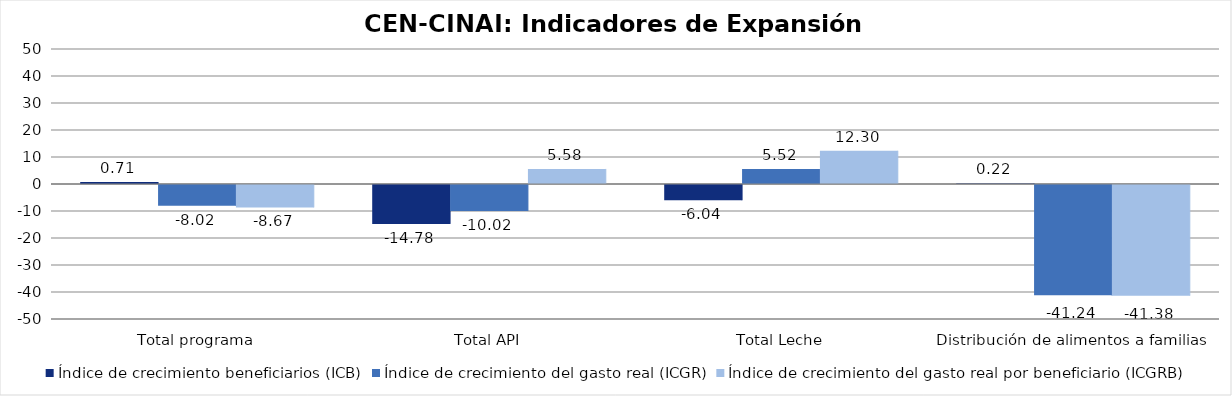
| Category | Índice de crecimiento beneficiarios (ICB)  | Índice de crecimiento del gasto real (ICGR)  | Índice de crecimiento del gasto real por beneficiario (ICGRB)  |
|---|---|---|---|
| Total programa | 0.714 | -8.022 | -8.674 |
| Total API | -14.782 | -10.023 | 5.584 |
| Total Leche | -6.038 | 5.521 | 12.301 |
| Distribución de alimentos a familias  | 0.224 | -41.245 | -41.376 |